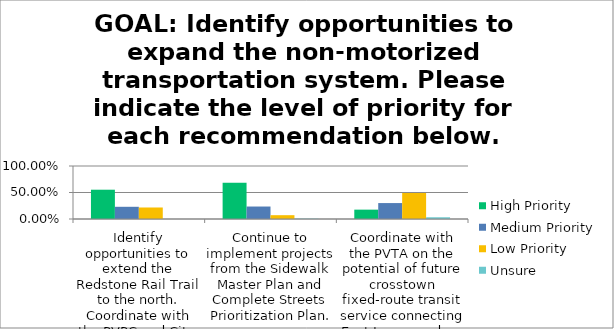
| Category | High Priority | Medium Priority | Low Priority | Unsure |
|---|---|---|---|---|
| Identify opportunities to extend the Redstone Rail Trail to the north. Coordinate with the PVPC and City of Springfield to identify future opportunities to connect with existing and planned bicycle facilities. | 0.553 | 0.23 | 0.217 | 0 |
| Continue to implement projects from the Sidewalk Master Plan and Complete Streets Prioritization Plan. | 0.686 | 0.235 | 0.072 | 0.007 |
| Coordinate with the PVTA on the potential of future crosstown fixed-route transit service connecting East Longmeadow center to the Ludlow Big Y, via Elm, Cooley, and Parker Streets. | 0.176 | 0.301 | 0.49 | 0.033 |